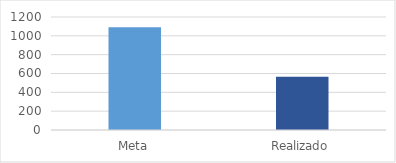
| Category | Series 0 |
|---|---|
| Meta | 1090 |
| Realizado | 566 |